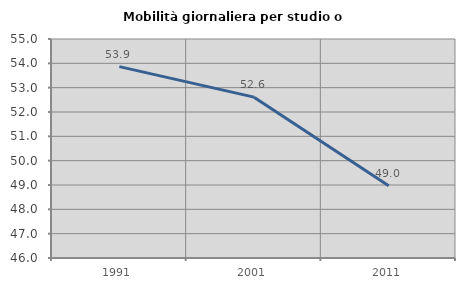
| Category | Mobilità giornaliera per studio o lavoro |
|---|---|
| 1991.0 | 53.864 |
| 2001.0 | 52.611 |
| 2011.0 | 48.966 |